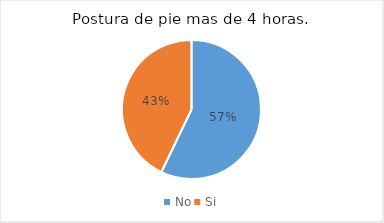
| Category | Series 0 |
|---|---|
| No | 4 |
| Si | 3 |